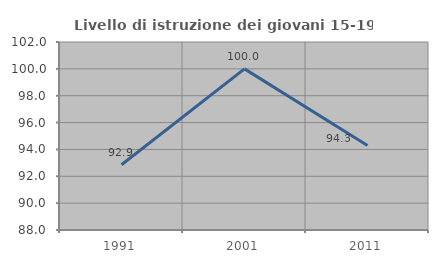
| Category | Livello di istruzione dei giovani 15-19 anni |
|---|---|
| 1991.0 | 92.857 |
| 2001.0 | 100 |
| 2011.0 | 94.286 |